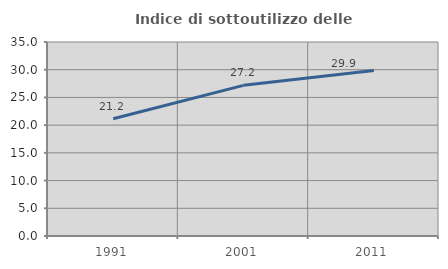
| Category | Indice di sottoutilizzo delle abitazioni  |
|---|---|
| 1991.0 | 21.157 |
| 2001.0 | 27.183 |
| 2011.0 | 29.858 |